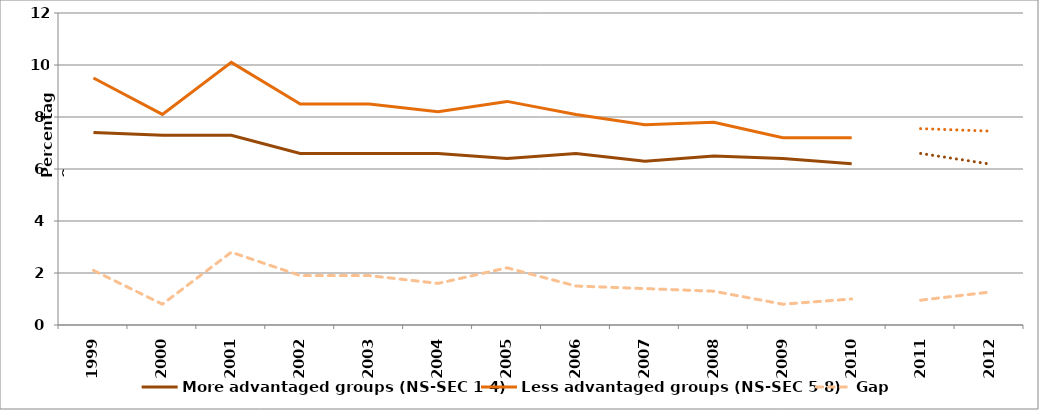
| Category | More advantaged groups (NS-SEC 1-4) | Less advantaged groups (NS-SEC 5-8) | Gap |
|---|---|---|---|
| 1999.0 | 7.4 | 9.5 | 2.1 |
| 2000.0 | 7.3 | 8.1 | 0.8 |
| 2001.0 | 7.3 | 10.1 | 2.8 |
| 2002.0 | 6.6 | 8.5 | 1.9 |
| 2003.0 | 6.6 | 8.5 | 1.9 |
| 2004.0 | 6.6 | 8.2 | 1.6 |
| 2005.0 | 6.4 | 8.6 | 2.2 |
| 2006.0 | 6.6 | 8.1 | 1.5 |
| 2007.0 | 6.3 | 7.7 | 1.4 |
| 2008.0 | 6.5 | 7.8 | 1.3 |
| 2009.0 | 6.4 | 7.2 | 0.8 |
| 2010.0 | 6.2 | 7.2 | 1 |
| 2011.0 | 6.598 | 7.552 | 0.954 |
| 2012.0 | 6.193 | 7.459 | 1.265 |